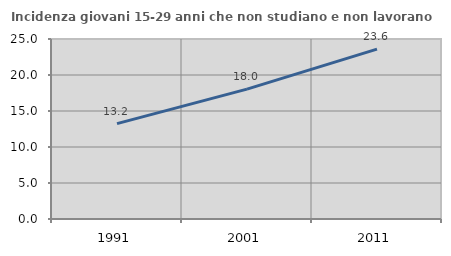
| Category | Incidenza giovani 15-29 anni che non studiano e non lavorano  |
|---|---|
| 1991.0 | 13.246 |
| 2001.0 | 18.041 |
| 2011.0 | 23.602 |